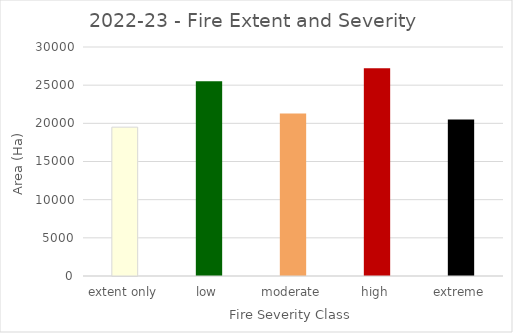
| Category | Severity class |
|---|---|
| extent only | 19500 |
| low | 25500 |
| moderate | 21300 |
| high | 27200 |
| extreme | 20500 |